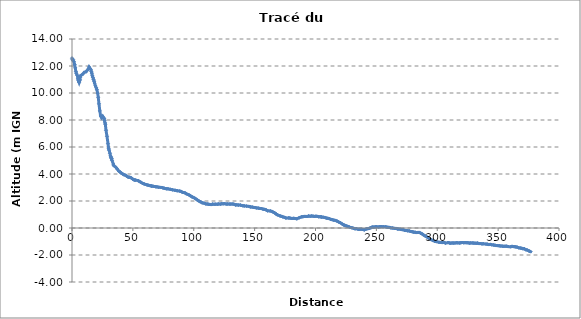
| Category | Series 0 |
|---|---|
| 0.0 | 12.583 |
| 0.20402206709560117 | 12.458 |
| 0.9707440446707084 | 12.485 |
| 1.5343493834078823 | 12.329 |
| 2.186398866080231 | 12.106 |
| 2.6693295034238047 | 11.86 |
| 3.1968542343412065 | 11.593 |
| 3.528116352417167 | 11.46 |
| 4.3374620554034 | 11.301 |
| 4.884940541293892 | 11.046 |
| 5.236907579584083 | 10.907 |
| 5.844997870555832 | 10.769 |
| 6.578646754673257 | 10.969 |
| 6.692521870917738 | 11.149 |
| 7.168134006636532 | 11.298 |
| 8.499893244449181 | 11.367 |
| 10.066190937451445 | 11.532 |
| 11.493673607826862 | 11.572 |
| 13.403676295979576 | 11.779 |
| 14.067768336890884 | 11.924 |
| 15.412165843214598 | 11.745 |
| 15.858297048731261 | 11.598 |
| 16.278088502866147 | 11.472 |
| 16.698064349266737 | 11.277 |
| 17.190950768545108 | 11.152 |
| 17.656916067144337 | 11.005 |
| 18.189787831096115 | 10.867 |
| 18.568726638547517 | 10.735 |
| 19.220417529653695 | 10.528 |
| 19.93515106466602 | 10.382 |
| 20.43252515966357 | 10.245 |
| 21.075445072816414 | 9.989 |
| 21.55296551312252 | 9.682 |
| 22.159643882425442 | 9.196 |
| 22.839694962242472 | 8.673 |
| 23.519588653998714 | 8.302 |
| 24.40295541520607 | 8.166 |
| 25.233982523610244 | 8.278 |
| 26.425273092758093 | 8.118 |
| 26.748989242781786 | 7.947 |
| 27.14514428006571 | 7.784 |
| 27.38129978624642 | 7.68 |
| 27.934537091904108 | 7.24 |
| 28.74811246941914 | 6.79 |
| 29.580769607095277 | 6.246 |
| 30.123138574066335 | 5.874 |
| 30.445050911100225 | 5.768 |
| 31.164914015742877 | 5.539 |
| 31.57587169032066 | 5.341 |
| 31.94746533947027 | 5.275 |
| 32.074379722745874 | 5.234 |
| 32.46543322653232 | 5.136 |
| 32.4669975518087 | 5.134 |
| 32.85570552610034 | 5.009 |
| 33.947878484762875 | 4.734 |
| 34.29803635749127 | 4.626 |
| 36.08967017024972 | 4.489 |
| 37.20884101926294 | 4.36 |
| 38.34986080779033 | 4.222 |
| 39.52618258528625 | 4.147 |
| 40.55458201933677 | 4.058 |
| 41.74940538499622 | 3.996 |
| 42.82320241144749 | 3.937 |
| 43.987564797427154 | 3.909 |
| 45.139059990562046 | 3.823 |
| 46.21796699315012 | 3.764 |
| 47.282213462054266 | 3.762 |
| 48.639548732590804 | 3.714 |
| 49.78349686373586 | 3.634 |
| 50.88349093750956 | 3.569 |
| 51.49698742649687 | 3.55 |
| 52.28438809037766 | 3.548 |
| 54.46948350194608 | 3.506 |
| 55.51206720103872 | 3.438 |
| 56.772600028366384 | 3.377 |
| 58.187888859576205 | 3.297 |
| 59.32050311785218 | 3.26 |
| 60.70219120475708 | 3.221 |
| 61.75213346851762 | 3.187 |
| 62.768815969536334 | 3.168 |
| 64.04230255104683 | 3.138 |
| 64.9850717697817 | 3.121 |
| 65.25814586110528 | 3.1 |
| 66.40258897231298 | 3.099 |
| 67.57378101966837 | 3.076 |
| 68.72738367125757 | 3.056 |
| 69.8455514693098 | 3.046 |
| 71.25947452127242 | 3.019 |
| 73.33665992460223 | 3.003 |
| 74.5235429878073 | 2.98 |
| 75.62182490776986 | 2.948 |
| 76.62207636429595 | 2.924 |
| 77.69242643562625 | 2.902 |
| 78.80427810701575 | 2.903 |
| 80.67145838872462 | 2.867 |
| 82.66165875473331 | 2.826 |
| 84.58710657412932 | 2.794 |
| 86.31753511126054 | 2.766 |
| 86.45866902752444 | 2.764 |
| 88.50222729944906 | 2.734 |
| 89.6341192910283 | 2.709 |
| 90.72249272785682 | 2.639 |
| 92.6696741116686 | 2.61 |
| 93.85064225008763 | 2.54 |
| 95.0088085955931 | 2.487 |
| 96.1268066038324 | 2.447 |
| 97.22644852076365 | 2.39 |
| 98.60626773194994 | 2.304 |
| 99.71048671952987 | 2.266 |
| 100.99076801858155 | 2.195 |
| 102.21313705131233 | 2.128 |
| 103.29696581212228 | 2.044 |
| 104.49228074332736 | 1.985 |
| 105.07814012884482 | 1.951 |
| 105.6515486913167 | 1.941 |
| 106.92293408267967 | 1.865 |
| 108.42340847355474 | 1.841 |
| 109.77094345549426 | 1.788 |
| 110.90882650658669 | 1.779 |
| 111.97781695444665 | 1.761 |
| 113.11172679323731 | 1.745 |
| 114.30055507270943 | 1.734 |
| 115.46623377505887 | 1.77 |
| 116.75664072372297 | 1.756 |
| 118.03901576205362 | 1.767 |
| 119.34857572342953 | 1.762 |
| 120.47541890061628 | 1.781 |
| 121.80025282145253 | 1.766 |
| 122.88243443196185 | 1.794 |
| 124.13593779746546 | 1.791 |
| 125.28619382606485 | 1.807 |
| 126.65568028106637 | 1.772 |
| 127.84126588896834 | 1.779 |
| 129.1574680009905 | 1.774 |
| 130.38473614450052 | 1.771 |
| 131.56727403431492 | 1.774 |
| 132.88595487322414 | 1.767 |
| 134.2972385903738 | 1.708 |
| 135.42411250635794 | 1.716 |
| 136.69371427402146 | 1.695 |
| 138.2453568158664 | 1.699 |
| 139.29480105090573 | 1.668 |
| 140.48047099383717 | 1.645 |
| 141.54440282814264 | 1.637 |
| 143.47014415828556 | 1.62 |
| 145.50355926852777 | 1.598 |
| 145.91488124973074 | 1.584 |
| 146.55925466452484 | 1.563 |
| 147.93342829395394 | 1.554 |
| 149.26460828625656 | 1.524 |
| 150.42501290656486 | 1.511 |
| 151.81589688859202 | 1.483 |
| 153.19787377800333 | 1.47 |
| 154.37655294097655 | 1.446 |
| 155.61025480382813 | 1.441 |
| 156.98349608771954 | 1.392 |
| 158.15450763442925 | 1.38 |
| 159.39155357498402 | 1.346 |
| 160.74991496095578 | 1.271 |
| 162.78197982921782 | 1.266 |
| 164.0947474600528 | 1.229 |
| 165.3334394159938 | 1.167 |
| 166.46248949784228 | 1.123 |
| 167.59986637163968 | 1.037 |
| 168.39026982651464 | 0.995 |
| 168.82262182863317 | 0.975 |
| 170.93849789948626 | 0.892 |
| 172.12649268269817 | 0.862 |
| 173.15213815682878 | 0.825 |
| 174.48215672661283 | 0.79 |
| 175.74377595873293 | 0.739 |
| 177.7524403326527 | 0.748 |
| 178.85581842921016 | 0.741 |
| 180.11521339664478 | 0.709 |
| 181.1944041530244 | 0.711 |
| 182.2763110908483 | 0.716 |
| 183.48442536945527 | 0.702 |
| 184.6378961952193 | 0.682 |
| 186.62708138964 | 0.76 |
| 188.5105038374027 | 0.828 |
| 189.62155878930244 | 0.836 |
| 190.8903945669528 | 0.86 |
| 191.9382689308422 | 0.857 |
| 193.1559240008007 | 0.855 |
| 194.32532690256795 | 0.888 |
| 195.56465359501746 | 0.871 |
| 196.84453469962207 | 0.889 |
| 197.99598817365694 | 0.874 |
| 199.16453995809968 | 0.857 |
| 200.39215590600026 | 0.87 |
| 201.5605987086452 | 0.86 |
| 202.64242649527156 | 0.832 |
| 203.7937883960094 | 0.839 |
| 204.6270157582793 | 0.82 |
| 204.87602535198826 | 0.815 |
| 206.2088010846627 | 0.8 |
| 207.55593697615507 | 0.782 |
| 208.8729218954789 | 0.734 |
| 210.07684340060098 | 0.72 |
| 211.33550229164697 | 0.693 |
| 212.66351814104112 | 0.635 |
| 213.85571123078753 | 0.614 |
| 215.12628386580755 | 0.579 |
| 216.3387439113473 | 0.562 |
| 217.65526800233596 | 0.512 |
| 218.940938972098 | 0.45 |
| 220.08484258998337 | 0.404 |
| 221.34204222025375 | 0.339 |
| 222.43964055411251 | 0.258 |
| 223.48286658321385 | 0.211 |
| 223.85498111468442 | 0.202 |
| 224.7647463927057 | 0.181 |
| 226.19696987582566 | 0.125 |
| 227.36757653184117 | 0.096 |
| 228.7731585769527 | 0.035 |
| 229.9376685297582 | 0.018 |
| 231.24370206019373 | -0.021 |
| 232.4795547243604 | -0.058 |
| 233.58136595256 | -0.045 |
| 235.0369444351855 | -0.097 |
| 236.21586454856524 | -0.1 |
| 237.42082764713817 | -0.091 |
| 238.7333263508041 | -0.106 |
| 240.03392003354293 | -0.139 |
| 241.06621664312854 | -0.093 |
| 242.19560705655093 | -0.063 |
| 243.35394259685862 | -0.043 |
| 244.465298088555 | -0.015 |
| 245.52878162181224 | 0.02 |
| 246.59479323759518 | 0.073 |
| 247.89534277322585 | 0.067 |
| 249.0454842085385 | 0.089 |
| 250.23286001169464 | 0.096 |
| 251.59897898948054 | 0.071 |
| 252.63446867138296 | 0.089 |
| 253.7852887633917 | 0.108 |
| 255.94487760642002 | 0.098 |
| 257.7465746134323 | 0.087 |
| 258.8158138288451 | 0.06 |
| 260.4691653556128 | 0.045 |
| 260.7707515169737 | 0.04 |
| 261.9806811296295 | 0.009 |
| 263.4136717877524 | 0.002 |
| 264.7475696285952 | -0.028 |
| 265.98493317102015 | -0.032 |
| 267.3136243678362 | -0.069 |
| 268.42285959628487 | -0.074 |
| 269.6308491289576 | -0.091 |
| 270.9522301054887 | -0.119 |
| 272.249515941404 | -0.129 |
| 273.427679990364 | -0.18 |
| 274.58384623644287 | -0.188 |
| 275.76156899181916 | -0.206 |
| 277.0024013798587 | -0.216 |
| 278.3144781073814 | -0.257 |
| 279.54910040252213 | -0.279 |
| 280.6450003798098 | -0.305 |
| 281.7856641909215 | -0.315 |
| 282.86242419416914 | -0.339 |
| 283.96485061245596 | -0.328 |
| 285.1042435572647 | -0.327 |
| 286.3231347876349 | -0.379 |
| 287.55244497866005 | -0.436 |
| 288.6803917840835 | -0.512 |
| 289.9768360102948 | -0.582 |
| 291.0566397792971 | -0.638 |
| 292.3237364974193 | -0.714 |
| 293.5912943259721 | -0.785 |
| 294.80867772280226 | -0.855 |
| 296.4322017336604 | -0.924 |
| 296.5674835390216 | -0.934 |
| 298.09402495453173 | -0.994 |
| 299.37351005891617 | -1.01 |
| 301.4847727608774 | -1.06 |
| 302.9154413756663 | -1.075 |
| 304.1613305316006 | -1.083 |
| 305.40327824184965 | -1.073 |
| 306.7815089760357 | -1.12 |
| 308.8661498219665 | -1.082 |
| 310.1340227158493 | -1.111 |
| 311.10830145476575 | -1.125 |
| 312.1961928509921 | -1.105 |
| 313.2487073748184 | -1.117 |
| 314.5438651902783 | -1.11 |
| 315.7416407328185 | -1.093 |
| 316.9103396447601 | -1.1 |
| 318.18404570025075 | -1.105 |
| 319.2094362712525 | -1.099 |
| 320.50551284849126 | -1.075 |
| 321.7032899867213 | -1.091 |
| 322.8352713959331 | -1.082 |
| 324.0223829068029 | -1.088 |
| 325.1549883644108 | -1.089 |
| 326.34588867493034 | -1.121 |
| 327.5118340205896 | -1.102 |
| 328.76074711762135 | -1.108 |
| 329.90500167015256 | -1.119 |
| 330.9887406591341 | -1.122 |
| 332.07682040422355 | -1.132 |
| 333.1163331904259 | -1.118 |
| 334.4225717815953 | -1.155 |
| 335.56745289648194 | -1.152 |
| 336.7835390682807 | -1.177 |
| 337.9152809691753 | -1.166 |
| 340.0854509114277 | -1.192 |
| 341.235549478097 | -1.2 |
| 342.38594912813943 | -1.227 |
| 343.6227715133679 | -1.213 |
| 344.7284010326202 | -1.24 |
| 346.1281023028858 | -1.258 |
| 347.3807209439709 | -1.274 |
| 348.572752566522 | -1.301 |
| 349.7778834921302 | -1.305 |
| 351.01895571117564 | -1.319 |
| 352.26574585192725 | -1.334 |
| 353.5122303067117 | -1.345 |
| 354.71268374554177 | -1.36 |
| 355.7563965466571 | -1.35 |
| 357.01014706509744 | -1.347 |
| 358.3197475465901 | -1.377 |
| 360.402423490153 | -1.388 |
| 361.4243354300732 | -1.359 |
| 362.7678125083355 | -1.377 |
| 363.1323887953233 | -1.376 |
| 364.1412405315305 | -1.396 |
| 365.40497461790966 | -1.41 |
| 366.94367616303805 | -1.465 |
| 368.1869956802156 | -1.484 |
| 369.2773535322634 | -1.5 |
| 370.3625401127645 | -1.533 |
| 371.3686942336103 | -1.53 |
| 372.7339625913837 | -1.609 |
| 373.74584308222154 | -1.627 |
| 375.49738188058836 | -1.706 |
| 375.98063663575465 | -1.735 |
| 376.76652480014354 | -1.755 |